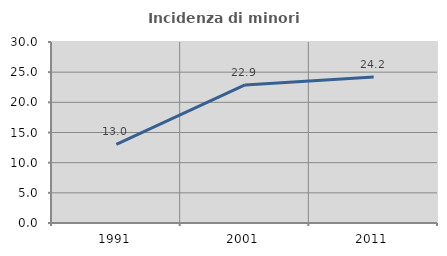
| Category | Incidenza di minori stranieri |
|---|---|
| 1991.0 | 13.043 |
| 2001.0 | 22.892 |
| 2011.0 | 24.18 |